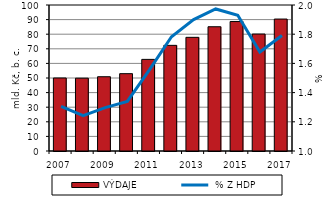
| Category | VÝDAJE |
|---|---|
| 2007.0 | 50.009 |
| 2008.0 | 49.872 |
| 2009.0 | 50.875 |
| 2010.0 | 52.974 |
| 2011.0 | 62.753 |
| 2012.0 | 72.36 |
| 2013.0 | 77.853 |
| 2014.0 | 85.104 |
| 2015.0 | 88.663 |
| 2016.0 | 80.109 |
| 2017.0 | 90.377 |